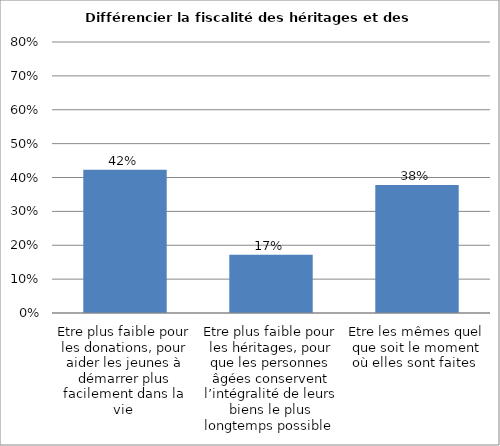
| Category | Ensemble |
|---|---|
| Etre plus faible pour les donations, pour aider les jeunes à démarrer plus facilement dans la vie  | 0.423 |
| Etre plus faible pour les héritages, pour que les personnes âgées conservent l’intégralité de leurs biens le plus longtemps possible  | 0.172 |
| Etre les mêmes quel que soit le moment où elles sont faites  | 0.378 |